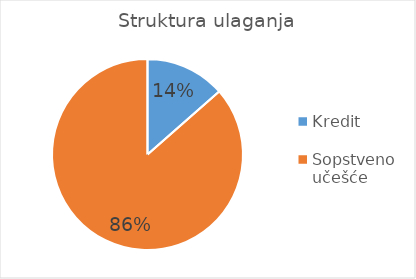
| Category | Series 0 |
|---|---|
| Kredit | 100000 |
| Sopstveno učešće | 639915 |